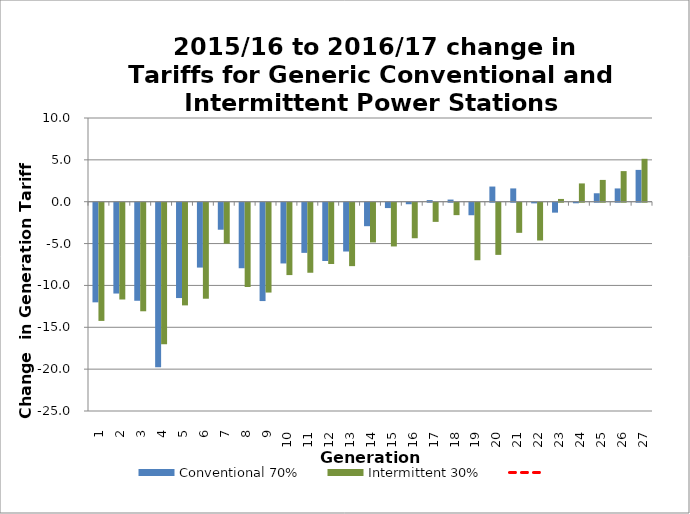
| Category | Conventional 70% | Intermittent 30% |
|---|---|---|
| 1.0 | -11.901 | -14.119 |
| 2.0 | -10.849 | -11.562 |
| 3.0 | -11.713 | -12.968 |
| 4.0 | -19.665 | -16.912 |
| 5.0 | -11.388 | -12.265 |
| 6.0 | -7.749 | -11.468 |
| 7.0 | -3.226 | -4.894 |
| 8.0 | -7.828 | -10.069 |
| 9.0 | -11.749 | -10.733 |
| 10.0 | -7.255 | -8.645 |
| 11.0 | -5.991 | -8.366 |
| 12.0 | -6.961 | -7.322 |
| 13.0 | -5.829 | -7.576 |
| 14.0 | -2.805 | -4.746 |
| 15.0 | -0.64 | -5.225 |
| 16.0 | -0.183 | -4.245 |
| 17.0 | 0.193 | -2.289 |
| 18.0 | 0.256 | -1.484 |
| 19.0 | -1.497 | -6.871 |
| 20.0 | 1.812 | -6.232 |
| 21.0 | 1.588 | -3.598 |
| 22.0 | -0.077 | -4.513 |
| 23.0 | -1.186 | 0.331 |
| 24.0 | -0.067 | 2.185 |
| 25.0 | 1.008 | 2.604 |
| 26.0 | 1.587 | 3.656 |
| 27.0 | 3.801 | 5.126 |